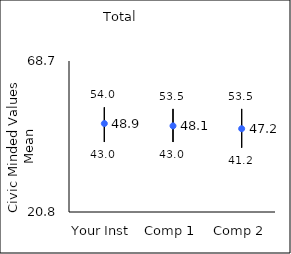
| Category | 25th percentile | 75th percentile | Mean |
|---|---|---|---|
| Your Inst | 43 | 54 | 48.86 |
| Comp 1 | 43 | 53.5 | 48.12 |
| Comp 2 | 41.2 | 53.5 | 47.22 |